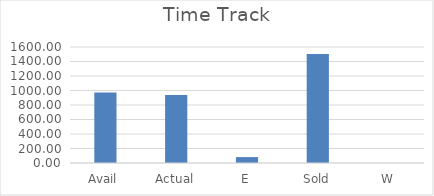
| Category | Series 0 |
|---|---|
| Avail | 972.85 |
| Actual | 938.36 |
| E | 81.36 |
| Sold | 1503.48 |
| W | 0 |